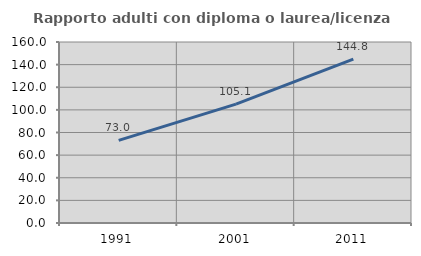
| Category | Rapporto adulti con diploma o laurea/licenza media  |
|---|---|
| 1991.0 | 73.039 |
| 2001.0 | 105.058 |
| 2011.0 | 144.807 |